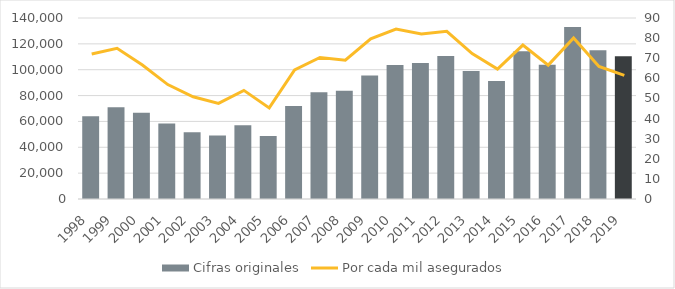
| Category | Cifras originales |
|---|---|
| 1998.0 | 63944 |
| 1999.0 | 70946 |
| 2000.0 | 66712 |
| 2001.0 | 58395 |
| 2002.0 | 51717 |
| 2003.0 | 49153 |
| 2004.0 | 57056 |
| 2005.0 | 48653 |
| 2006.0 | 71892 |
| 2007.0 | 82545 |
| 2008.0 | 83759 |
| 2009.0 | 95434 |
| 2010.0 | 103580 |
| 2011.0 | 105150 |
| 2012.0 | 110638 |
| 2013.0 | 98948 |
| 2014.0 | 91322 |
| 2015.0 | 114358 |
| 2016.0 | 103784 |
| 2017.0 | 132968 |
| 2018.0 | 114985 |
| 2019.0 | 110416 |